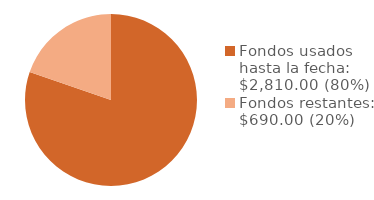
| Category | Series 0 |
|---|---|
| Fondos usados hasta la fecha: $2,810.00 (80%) | 2810 |
| Fondos restantes: $690.00 (20%) | 690 |